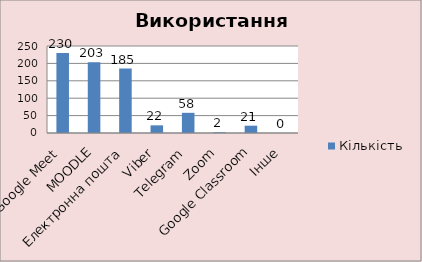
| Category | Кількість |
|---|---|
| Google Meet | 230 |
| MOODLE | 203 |
| Електронна пошта | 185 |
| Viber | 22 |
| Telegram | 58 |
| Zoom | 2 |
| Google Classroom | 21 |
| Інше | 0 |